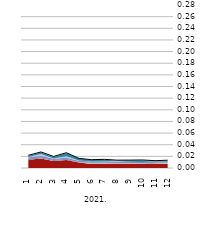
| Category | ПСС |
|---|---|
| 0 | 0.022 |
| 1 | 0.028 |
| 2 | 0.02 |
| 3 | 0.026 |
| 4 | 0.017 |
| 5 | 0.014 |
| 6 | 0.015 |
| 7 | 0.013 |
| 8 | 0.014 |
| 9 | 0.014 |
| 10 | 0.013 |
| 11 | 0.013 |